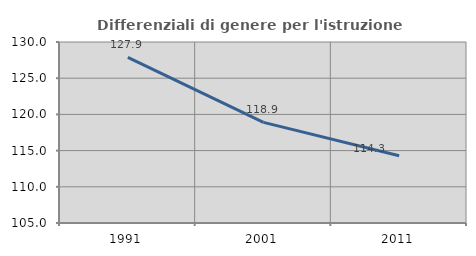
| Category | Differenziali di genere per l'istruzione superiore |
|---|---|
| 1991.0 | 127.881 |
| 2001.0 | 118.901 |
| 2011.0 | 114.278 |